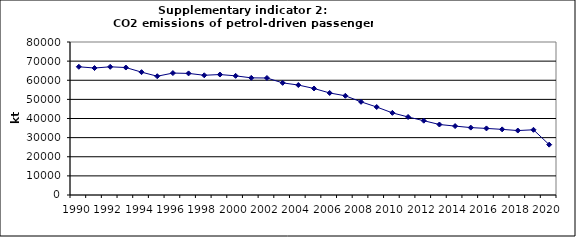
| Category | CO2 emissions of petrol-driven passenger cars, kt |
|---|---|
| 1990 | 67038.877 |
| 1991 | 66389.273 |
| 1992 | 67026.803 |
| 1993 | 66647.564 |
| 1994 | 64232.23 |
| 1995 | 62107.608 |
| 1996 | 63752.873 |
| 1997 | 63582.019 |
| 1998 | 62602.123 |
| 1999 | 62987.449 |
| 2000 | 62298.056 |
| 2001 | 61256.063 |
| 2002 | 61175.294 |
| 2003 | 58629.698 |
| 2004 | 57491.931 |
| 2005 | 55701.874 |
| 2006 | 53348.774 |
| 2007 | 51875.983 |
| 2008 | 48719.67 |
| 2009 | 46004.587 |
| 2010 | 42947.54 |
| 2011 | 40797.022 |
| 2012 | 38855.861 |
| 2013 | 36857.386 |
| 2014 | 36032.039 |
| 2015 | 35241.543 |
| 2016 | 34815.936 |
| 2017 | 34315.026 |
| 2018 | 33699.362 |
| 2019 | 34100.925 |
| 2020 | 26324.769 |